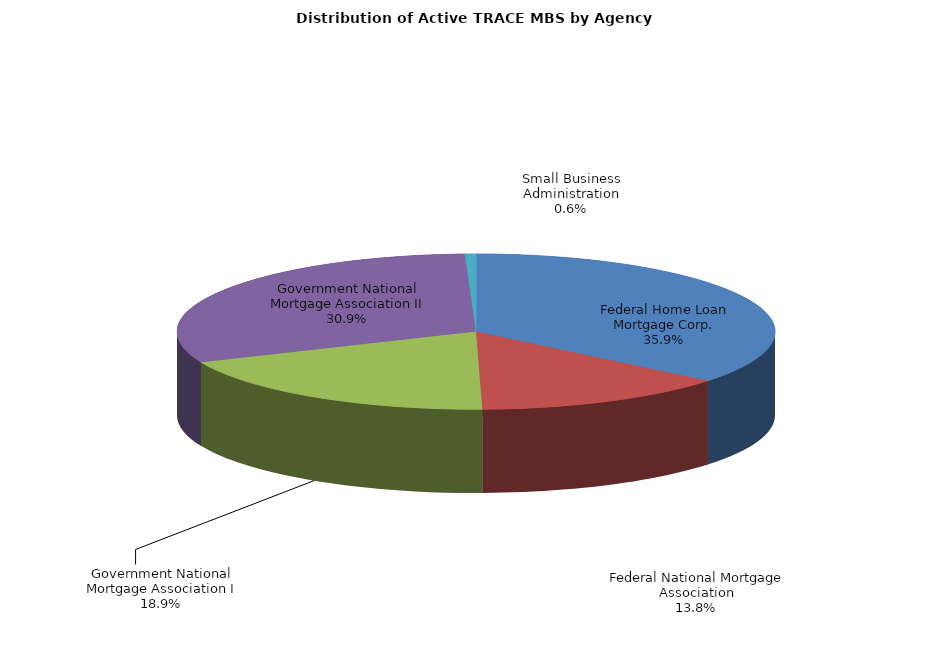
| Category | Series 0 |
|---|---|
| Federal Home Loan Mortgage Corp. | 239297 |
| Federal National Mortgage Association | 91822 |
| Government National Mortgage Association I | 125918 |
| Government National Mortgage Association II | 205689 |
| Small Business Administration | 3985 |